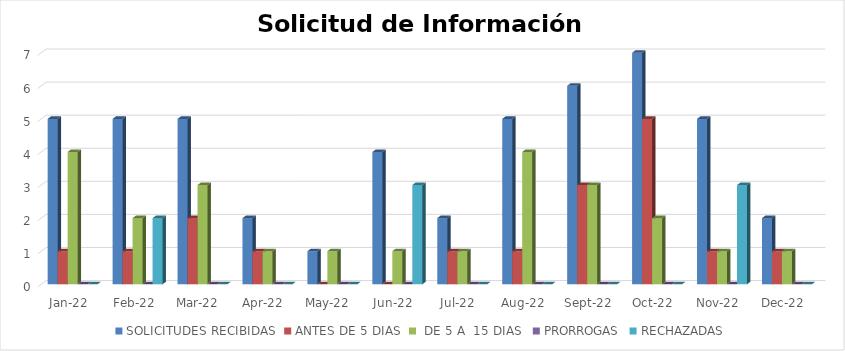
| Category | SOLICITUDES RECIBIDAS | ANTES DE 5 DIAS |  DE 5 A  15 DIAS  | PRORROGAS | RECHAZADAS |
|---|---|---|---|---|---|
| 2022-01-01 | 5 | 1 | 4 | 0 | 0 |
| 2022-02-01 | 5 | 1 | 2 | 0 | 2 |
| 2022-03-01 | 5 | 2 | 3 | 0 | 0 |
| 2022-04-01 | 2 | 1 | 1 | 0 | 0 |
| 2022-05-01 | 1 | 0 | 1 | 0 | 0 |
| 2022-06-01 | 4 | 0 | 1 | 0 | 3 |
| 2022-07-01 | 2 | 1 | 1 | 0 | 0 |
| 2022-08-01 | 5 | 1 | 4 | 0 | 0 |
| 2022-09-01 | 6 | 3 | 3 | 0 | 0 |
| 2022-10-01 | 7 | 5 | 2 | 0 | 0 |
| 2022-11-01 | 5 | 1 | 1 | 0 | 3 |
| 2022-12-01 | 2 | 1 | 1 | 0 | 0 |